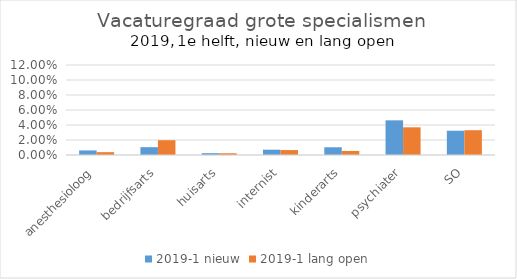
| Category | 2019-1 |
|---|---|
| anesthesioloog | 0.004 |
| bedrijfsarts | 0.02 |
| huisarts | 0.002 |
| internist | 0.007 |
| kinderarts | 0.005 |
| psychiater | 0.037 |
| SO | 0.033 |